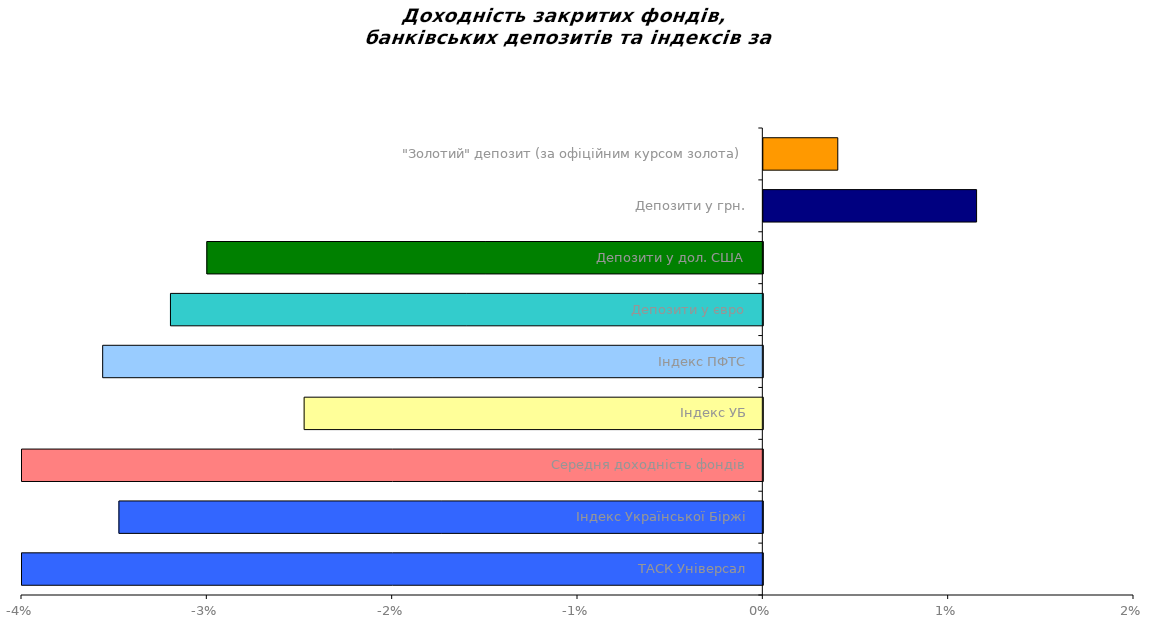
| Category | Series 0 |
|---|---|
| ТАСК Універсал | -0.075 |
| Індекс Української Біржі | -0.035 |
| Середня доходність фондів | -0.055 |
| Індекс УБ | -0.025 |
| Індекс ПФТС | -0.036 |
| Депозити у євро | -0.032 |
| Депозити у дол. США | -0.03 |
| Депозити у грн. | 0.012 |
| "Золотий" депозит (за офіційним курсом золота) | 0.004 |